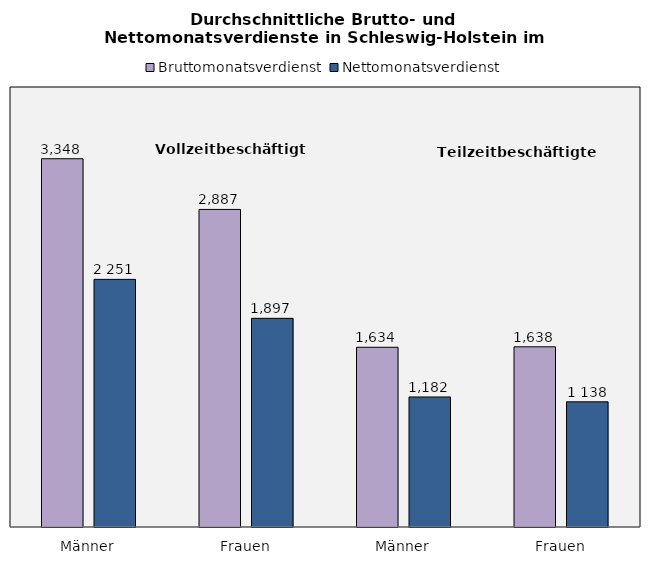
| Category | Bruttomonatsverdienst | Nettomonatsverdienst |
|---|---|---|
| Männer | 3348 | 2251 |
| Frauen | 2887 | 1897 |
| Männer | 1634 | 1182 |
| Frauen | 1638 | 1138 |